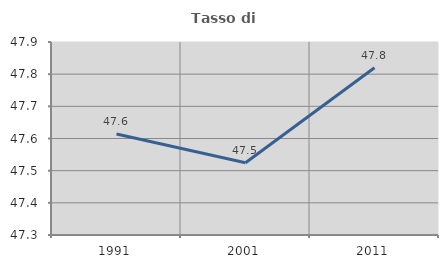
| Category | Tasso di occupazione   |
|---|---|
| 1991.0 | 47.614 |
| 2001.0 | 47.525 |
| 2011.0 | 47.82 |